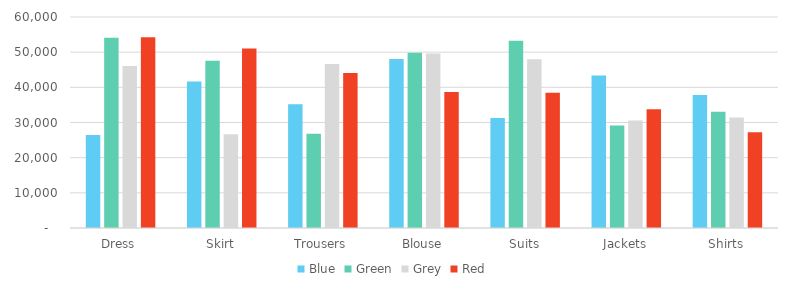
| Category | Blue | Green | Grey | Red |
|---|---|---|---|---|
| Dress | 26453 | 54132 | 46075 | 54255 |
| Skirt | 41641 | 47562 | 26678 | 51076 |
| Trousers | 35172 | 26819 | 46632 | 44105 |
| Blouse | 48088 | 49827 | 49596 | 38707 |
| Suits | 31307 | 53243 | 47985 | 38454 |
| Jackets | 43364 | 29170 | 30571 | 33768 |
| Shirts | 37787 | 33040 | 31391 | 27216 |